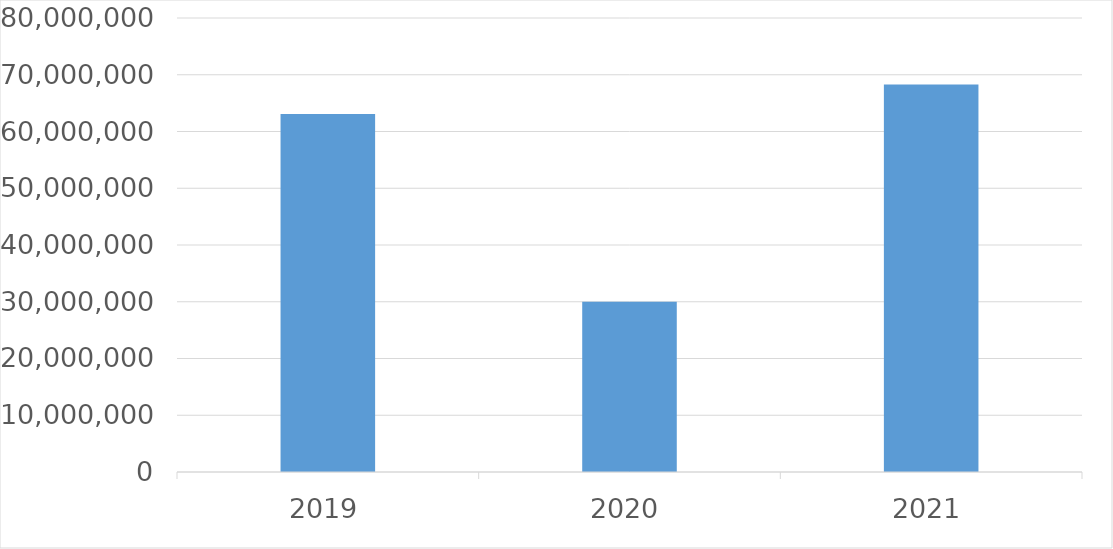
| Category | Series 0 |
|---|---|
| 2019 | 63075063 |
| 2020 | 30000000 |
| 2021 | 68287928 |